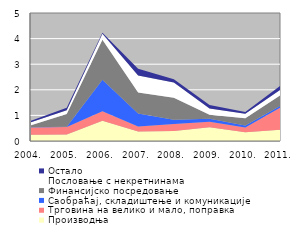
| Category | Производња | Трговина на велико и мало, поправка | Саобраћај, складиштење и комуникације | Финансијско посредовање | Пословање с некретнинама | Остало |
|---|---|---|---|---|---|---|
| 2004. | 0.24 | 0.283 | 0.012 | 0.084 | 0.114 | 0.058 |
| 2005. | 0.25 | 0.292 | 0.01 | 0.5 | 0.15 | 0.101 |
| 2006. | 0.789 | 0.369 | 1.233 | 1.562 | 0.238 | 0.041 |
| 2007. | 0.366 | 0.201 | 0.507 | 0.825 | 0.664 | 0.261 |
| 2008. | 0.388 | 0.276 | 0.168 | 0.861 | 0.588 | 0.133 |
| 2009. | 0.533 | 0.222 | 0.118 | 0.156 | 0.24 | 0.136 |
| 2010. | 0.338 | 0.194 | 0.075 | 0.285 | 0.177 | 0.062 |
| 2011. | 0.441 | 0.883 | 0.069 | 0.406 | 0.216 | 0.164 |